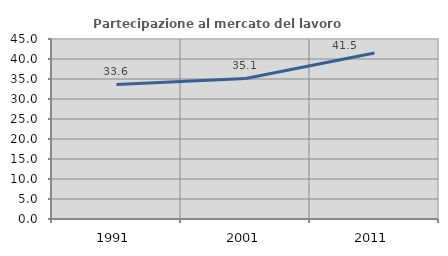
| Category | Partecipazione al mercato del lavoro  femminile |
|---|---|
| 1991.0 | 33.625 |
| 2001.0 | 35.141 |
| 2011.0 | 41.518 |